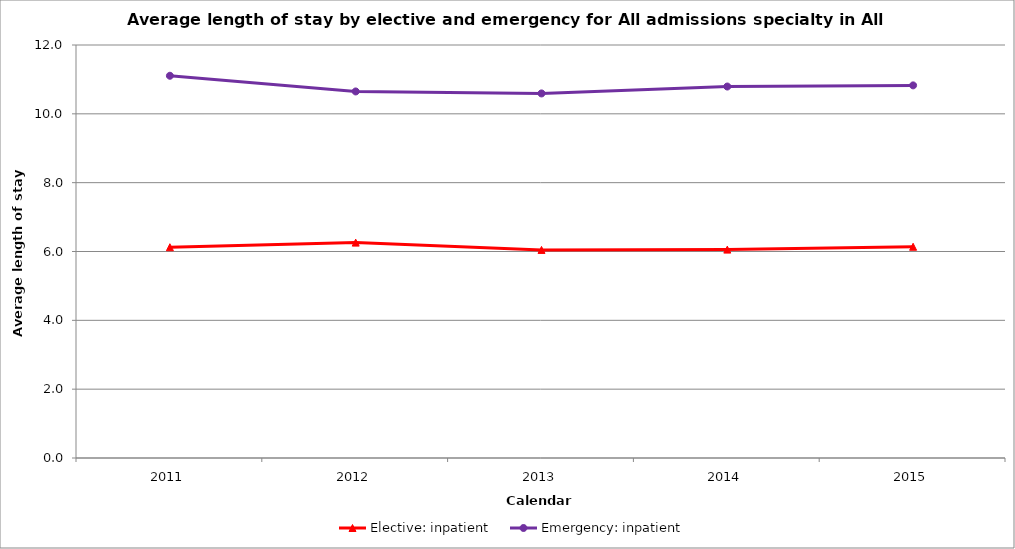
| Category | Elective: inpatient | Emergency: inpatient |
|---|---|---|
| 2011.0 | 6.124 | 11.106 |
| 2012.0 | 6.258 | 10.65 |
| 2013.0 | 6.046 | 10.593 |
| 2014.0 | 6.055 | 10.793 |
| 2015.0 | 6.138 | 10.827 |